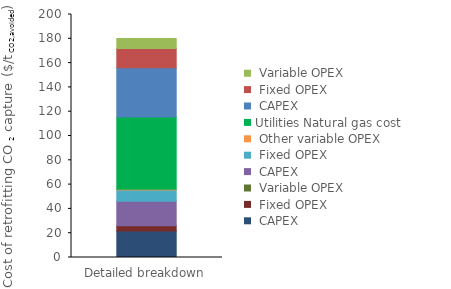
| Category | Interconnecting | Utilities | Series 0 | Series 1 | Series 2 |
|---|---|---|---|---|---|
| 0 | 0 | 59.624 | 40.377 | 16.001 | 8.192 |